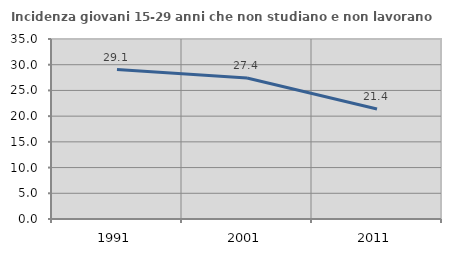
| Category | Incidenza giovani 15-29 anni che non studiano e non lavorano  |
|---|---|
| 1991.0 | 29.056 |
| 2001.0 | 27.403 |
| 2011.0 | 21.389 |